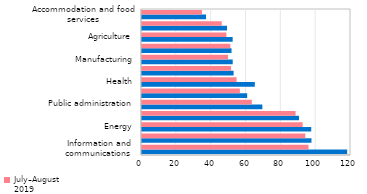
| Category | July–August 2020 | July–August 2019 |
|---|---|---|
| Information and communications  | 117.807 | 95.61 |
| Financial sector | 97.308 | 93.763 |
| Energy | 97.178 | 92.262 |
| Mining | 90.132 | 88.19 |
| Public administration | 69.105 | 63.065 |
| Education | 60.394 | 56.206 |
| Health | 64.777 | 54.301 |
| Transport and storage  | 52.602 | 51.154 |
| Manufacturing | 52.089 | 49.424 |
| Construction | 51.4 | 50.726 |
| Agriculture | 52.064 | 48.452 |
| Trade | 48.812 | 45.793 |
| Accommodation and food services | 36.774 | 34.429 |